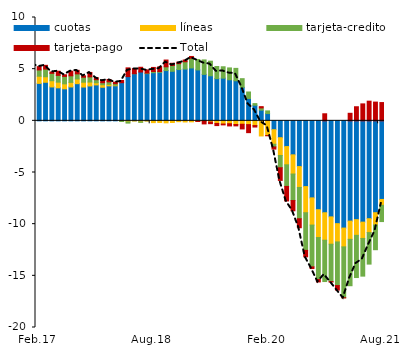
| Category | cuotas | líneas | tarjeta-credito | tarjeta-pago |
|---|---|---|---|---|
| 2017-01-01 | 3.74 | 0.623 | 0.65 | 0.485 |
| 2017-02-01 | 3.625 | 0.692 | 0.609 | 0.319 |
| 2017-03-01 | 3.732 | 0.533 | 0.744 | 0.361 |
| 2017-04-01 | 3.279 | 0.604 | 0.711 | 0.132 |
| 2017-05-01 | 3.195 | 0.548 | 0.657 | 0.402 |
| 2017-06-01 | 3.098 | 0.483 | 0.716 | 0.16 |
| 2017-07-01 | 3.279 | 0.44 | 0.639 | 0.443 |
| 2017-08-01 | 3.596 | 0.454 | 0.493 | 0.343 |
| 2017-09-01 | 3.27 | 0.467 | 0.482 | 0.135 |
| 2017-10-01 | 3.376 | 0.378 | 0.5 | 0.429 |
| 2017-11-01 | 3.476 | 0.205 | 0.301 | 0.192 |
| 2017-12-01 | 3.252 | 0.238 | 0.199 | 0.209 |
| 2018-01-01 | 3.387 | 0.147 | 0.241 | 0.23 |
| 2018-02-01 | 3.395 | 0.063 | 0.134 | 0.15 |
| 2018-03-01 | 3.692 | -0.001 | -0.062 | 0.209 |
| 2018-04-01 | 4.279 | -0.098 | -0.122 | 0.846 |
| 2018-05-01 | 4.557 | -0.017 | 0.005 | 0.492 |
| 2018-06-01 | 4.726 | -0.097 | -0.049 | 0.458 |
| 2018-07-01 | 4.568 | -0.023 | 0.053 | 0.309 |
| 2018-08-01 | 4.658 | -0.172 | 0.114 | 0.396 |
| 2018-09-01 | 4.693 | -0.157 | 0.078 | 0.457 |
| 2018-10-01 | 4.868 | -0.192 | 0.361 | 0.654 |
| 2018-11-01 | 4.796 | -0.159 | 0.561 | 0.212 |
| 2018-12-01 | 4.963 | -0.082 | 0.573 | 0.144 |
| 2019-01-01 | 5.01 | -0.109 | 0.707 | 0.168 |
| 2019-02-01 | 5.119 | -0.098 | 0.943 | 0.168 |
| 2019-03-01 | 4.926 | -0.05 | 1.006 | -0.016 |
| 2019-04-01 | 4.496 | -0.018 | 1.399 | -0.279 |
| 2019-05-01 | 4.362 | -0.116 | 1.41 | -0.158 |
| 2019-06-01 | 4.083 | -0.253 | 1.174 | -0.208 |
| 2019-07-01 | 4.132 | -0.31 | 1.102 | -0.083 |
| 2019-08-01 | 3.973 | -0.28 | 1.147 | -0.214 |
| 2019-09-01 | 3.878 | -0.355 | 1.199 | -0.133 |
| 2019-10-01 | 3.244 | -0.33 | 0.836 | -0.453 |
| 2019-11-01 | 2.167 | -0.366 | 0.625 | -0.778 |
| 2019-12-01 | 1.507 | -0.458 | 0.161 | -0.141 |
| 2020-01-01 | 1.035 | -1.464 | 0.213 | 0.125 |
| 2020-02-01 | 0.706 | -1.428 | 0.256 | -0.014 |
| 2020-03-01 | -0.858 | -1.409 | -0.259 | -0.207 |
| 2020-04-01 | -1.633 | -1.724 | -1.183 | -1.225 |
| 2020-05-01 | -2.492 | -1.765 | -2.089 | -1.406 |
| 2020-06-01 | -3.29 | -1.86 | -2.563 | -0.992 |
| 2020-07-01 | -4.427 | -2.019 | -3.031 | -0.867 |
| 2020-08-01 | -6.364 | -2.529 | -3.645 | -0.621 |
| 2020-09-01 | -7.456 | -2.634 | -4.044 | -0.162 |
| 2020-10-01 | -8.602 | -2.693 | -4.066 | -0.23 |
| 2020-11-01 | -8.894 | -2.658 | -4.001 | 0.683 |
| 2020-12-01 | -9.296 | -2.644 | -3.62 | -0.043 |
| 2021-01-01 | -9.951 | -1.769 | -4.222 | -0.435 |
| 2021-02-01 | -10.377 | -1.822 | -4.922 | -0.011 |
| 2021-03-01 | -9.705 | -1.762 | -4.49 | 0.73 |
| 2021-04-01 | -9.562 | -1.519 | -4.084 | 1.364 |
| 2021-05-01 | -9.803 | -1.579 | -3.646 | 1.641 |
| 2021-06-01 | -9.473 | -1.341 | -3.051 | 1.902 |
| 2021-07-01 | -8.891 | -1.19 | -2.391 | 1.813 |
| 2021-08-01 | -7.609 | -0.568 | -1.572 | 1.768 |